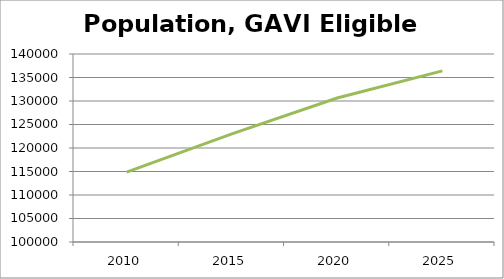
| Category | Population |
|---|---|
| 2010.0 | 114877 |
| 2015.0 | 122994 |
| 2020.0 | 130640 |
| 2025.0 | 136419 |